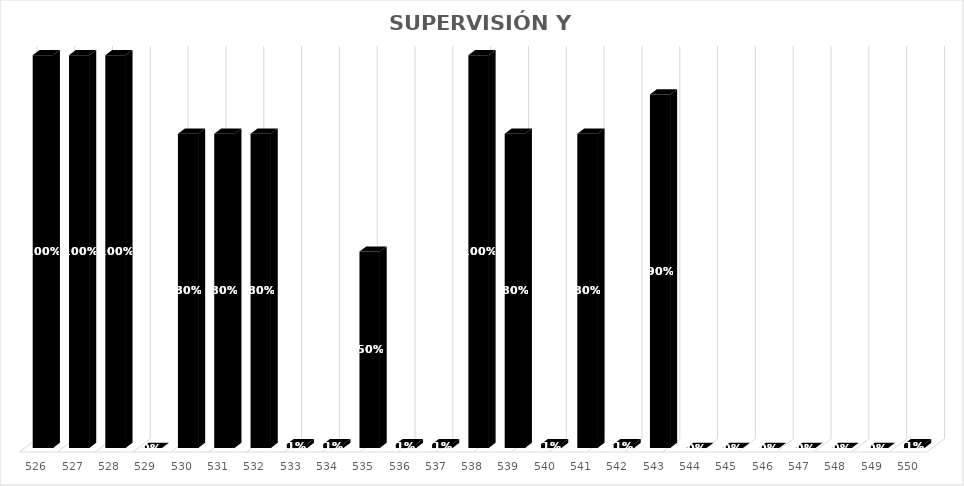
| Category | % Avance |
|---|---|
| 526.0 | 1 |
| 527.0 | 1 |
| 528.0 | 1 |
| 529.0 | 0 |
| 530.0 | 0.8 |
| 531.0 | 0.8 |
| 532.0 | 0.8 |
| 533.0 | 0.01 |
| 534.0 | 0.01 |
| 535.0 | 0.5 |
| 536.0 | 0.01 |
| 537.0 | 0.01 |
| 538.0 | 1 |
| 539.0 | 0.8 |
| 540.0 | 0.01 |
| 541.0 | 0.8 |
| 542.0 | 0.01 |
| 543.0 | 0.9 |
| 544.0 | 0 |
| 545.0 | 0 |
| 546.0 | 0 |
| 547.0 | 0 |
| 548.0 | 0 |
| 549.0 | 0 |
| 550.0 | 0.01 |